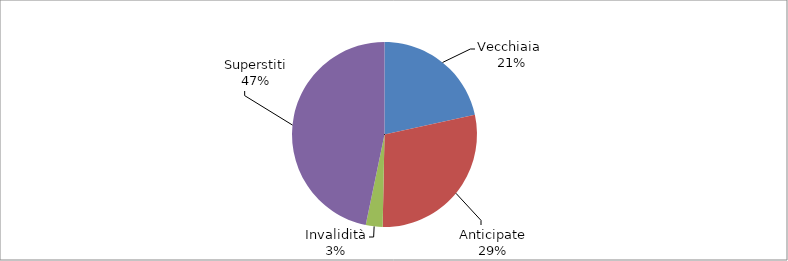
| Category | Series 0 |
|---|---|
| Vecchiaia  | 6894 |
| Anticipate | 9172 |
| Invalidità | 938 |
| Superstiti | 14924 |